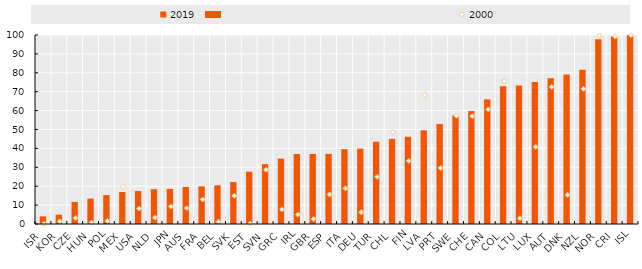
| Category | 2019 |
|---|---|
| ISR | 4.042 |
| KOR | 4.889 |
| CZE | 11.681 |
| HUN | 13.432 |
| POL | 15.271 |
| MEX | 16.936 |
| USA | 17.438 |
| NLD | 18.426 |
| JPN | 18.58 |
| AUS | 19.623 |
| FRA | 19.93 |
| BEL | 20.496 |
| SVK | 22.188 |
| EST | 27.705 |
| SVN | 31.683 |
| GRC | 34.561 |
| IRL | 37.014 |
| GBR | 37.066 |
| ESP | 37.115 |
| ITA | 39.603 |
| DEU | 39.895 |
| TUR | 43.526 |
| CHL | 45.002 |
| FIN | 46.166 |
| LVA | 49.581 |
| PRT | 52.885 |
| SWE | 57.388 |
| CHE | 59.76 |
| CAN | 65.957 |
| COL | 72.939 |
| LTU | 73.286 |
| LUX | 75.195 |
| AUT | 77.096 |
| DNK | 79.135 |
| NZL | 81.677 |
| NOR | 97.722 |
| CRI | 99.172 |
| ISL | 99.985 |